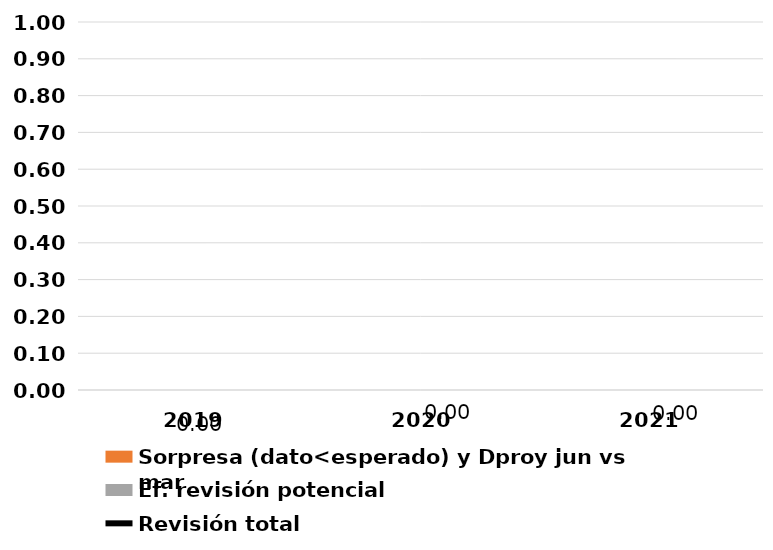
| Category | Sorpresa (dato<esperado) y Dproy jun vs mar | Ef. revisión potencial |
|---|---|---|
| 2019.0 | 0 | 0 |
| 2020.0 | 0 | 0 |
| 2021.0 | 0 | 0 |